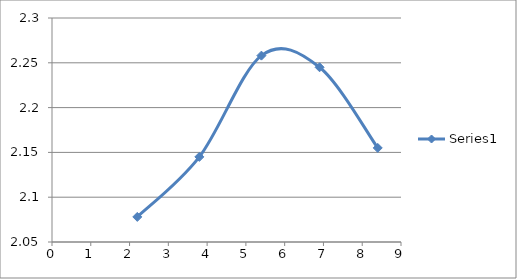
| Category | Series 0 |
|---|---|
| 2.2 | 2.078 |
| 3.8 | 2.145 |
| 5.4 | 2.258 |
| 6.9 | 2.245 |
| 8.4 | 2.155 |